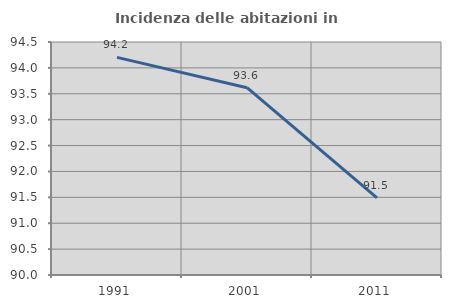
| Category | Incidenza delle abitazioni in proprietà  |
|---|---|
| 1991.0 | 94.203 |
| 2001.0 | 93.617 |
| 2011.0 | 91.489 |